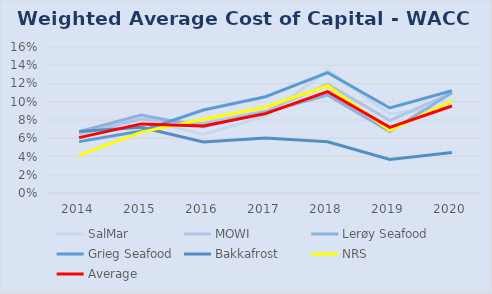
| Category | SalMar | MOWI | Lerøy Seafood | Grieg Seafood | Bakkafrost | NRS | Average |
|---|---|---|---|---|---|---|---|
| 2014.0 | 0.067 | 0.065 | 0.067 | 0.056 | 0.067 | 0.041 | 0.061 |
| 2015.0 | 0.081 | 0.081 | 0.086 | 0.068 | 0.072 | 0.067 | 0.076 |
| 2016.0 | 0.064 | 0.076 | 0.073 | 0.091 | 0.056 | 0.081 | 0.073 |
| 2017.0 | 0.084 | 0.09 | 0.088 | 0.106 | 0.06 | 0.094 | 0.087 |
| 2018.0 | 0.135 | 0.119 | 0.107 | 0.132 | 0.056 | 0.118 | 0.111 |
| 2019.0 | 0.087 | 0.079 | 0.067 | 0.093 | 0.037 | 0.068 | 0.072 |
| 2020.0 | 0.095 | 0.11 | 0.11 | 0.112 | 0.044 | 0.101 | 0.095 |